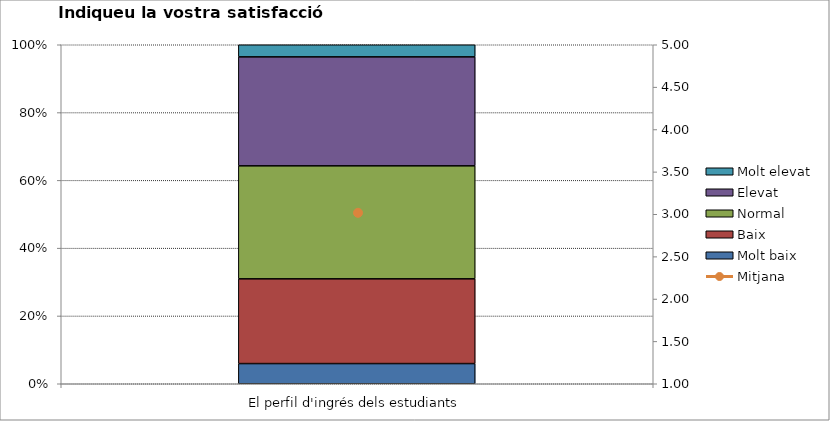
| Category | Molt baix | Baix | Normal  | Elevat | Molt elevat |
|---|---|---|---|---|---|
| El perfil d'ingrés dels estudiants | 5 | 21 | 28 | 27 | 3 |